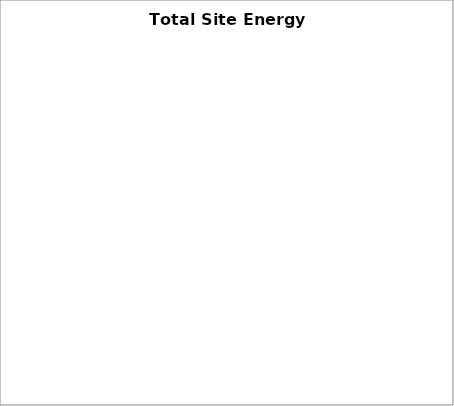
| Category | Total Site Energy Consumption |
|---|---|
| Space Heating  | 0 |
| Space Cooling  | 0 |
| Air Distribution (fans) | 0 |
| SHW/DHW | 0 |
| Conveyance | 0 |
| Lighting  | 0 |
| Plug Loads | 0 |
| Process Loads  | 0 |
| Refrigeration | 0 |
| Cooking | 0 |
| Information Technology | 0 |
| Other | 0 |